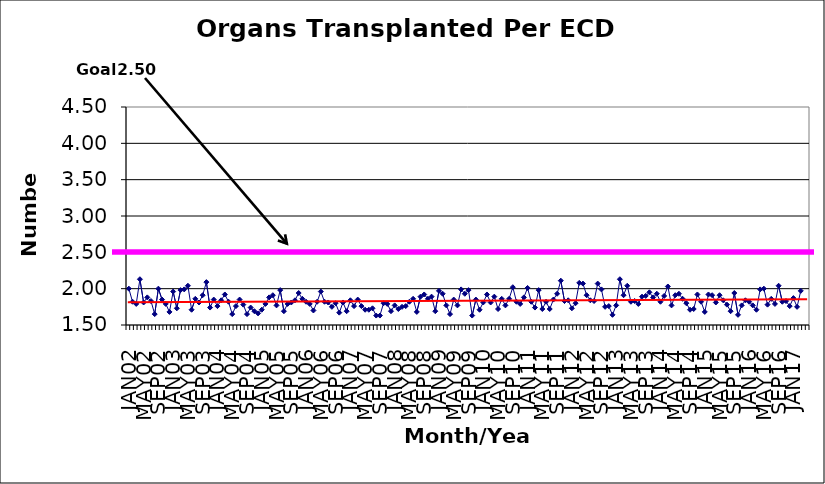
| Category | Series 0 |
|---|---|
| JAN02 | 2 |
| FEB02 | 1.82 |
| MAR02 | 1.79 |
| APR02 | 2.13 |
| MAY02 | 1.81 |
| JUN02 | 1.88 |
| JUL02 | 1.83 |
| AUG02 | 1.65 |
| SEP02 | 2 |
| OCT02 | 1.85 |
| NOV02 | 1.79 |
| DEC02 | 1.68 |
| JAN03 | 1.96 |
| FEB03 | 1.73 |
| MAR03 | 1.98 |
| APR03 | 1.99 |
| MAY03 | 2.04 |
| JUN03 | 1.71 |
| JUL03 | 1.86 |
| AUG03 | 1.81 |
| SEP03 | 1.91 |
| OCT03 | 2.09 |
| NOV03 | 1.74 |
| DEC03 | 1.85 |
| JAN04 | 1.76 |
| FEB04 | 1.84 |
| MAR04 | 1.92 |
| APR04 | 1.82 |
| MAY04 | 1.65 |
| JUN04 | 1.76 |
| JUL04 | 1.85 |
| AUG04 | 1.78 |
| SEP04 | 1.65 |
| OCT04 | 1.74 |
| NOV04 | 1.69 |
| DEC04 | 1.66 |
| JAN05 | 1.71 |
| FEB05 | 1.79 |
| MAR05 | 1.88 |
| APR05 | 1.91 |
| MAY05 | 1.77 |
| JUN05 | 1.98 |
| JUL05 | 1.69 |
| AUG05 | 1.79 |
| SEP05 | 1.81 |
| OCT05 | 1.84 |
| NOV05 | 1.94 |
| DEC05 | 1.86 |
| JAN06 | 1.82 |
| FEB06 | 1.79 |
| MAR06 | 1.7 |
| APR06 | 1.82 |
| MAY06 | 1.96 |
| JUN06 | 1.82 |
| JUL06 | 1.81 |
| AUG06 | 1.75 |
| SEP06 | 1.8 |
| OCT06 | 1.67 |
| NOV06 | 1.81 |
| DEC06 | 1.69 |
| JAN07 | 1.84 |
| FEB07 | 1.76 |
| MAR07 | 1.85 |
| APR07 | 1.76 |
| MAY07 | 1.71 |
| JUN07 | 1.71 |
| JUL07 | 1.73 |
| AUG07 | 1.63 |
| SEP07 | 1.63 |
| OCT07 | 1.8 |
| NOV07 | 1.79 |
| DEC07 | 1.69 |
| JAN08 | 1.77 |
| FEB08 | 1.72 |
| MAR08 | 1.75 |
| APR08 | 1.76 |
| MAY08 | 1.82 |
| JUN08 | 1.86 |
| JUL08 | 1.68 |
| AUG08 | 1.89 |
| SEP08 | 1.92 |
| OCT08 | 1.86 |
| NOV08 | 1.89 |
| DEC08 | 1.69 |
| JAN09 | 1.97 |
| FEB09 | 1.93 |
| MAR09 | 1.77 |
| APR09 | 1.65 |
| MAY09 | 1.85 |
| JUN09 | 1.77 |
| JUL09 | 1.99 |
| AUG09 | 1.93 |
| SEP09 | 1.98 |
| OCT09 | 1.63 |
| NOV09 | 1.85 |
| DEC09 | 1.71 |
| JAN10 | 1.81 |
| FEB10 | 1.92 |
| MAR10 | 1.81 |
| APR10 | 1.89 |
| MAY10 | 1.72 |
| JUN10 | 1.86 |
| JUL10 | 1.77 |
| AUG10 | 1.86 |
| SEP10 | 2.02 |
| OCT10 | 1.82 |
| NOV10 | 1.79 |
| DEC10 | 1.88 |
| JAN11 | 2.01 |
| FEB11 | 1.82 |
| MAR11 | 1.74 |
| APR11 | 1.98 |
| MAY11 | 1.72 |
| JUN11 | 1.82 |
| JUL11 | 1.72 |
| AUG11 | 1.85 |
| SEP11 | 1.93 |
| OCT11 | 2.11 |
| NOV11 | 1.83 |
| DEC11 | 1.84 |
| JAN12 | 1.73 |
| FEB12 | 1.8 |
| MAR12 | 2.08 |
| APR12 | 2.07 |
| MAY12 | 1.91 |
| JUN12 | 1.84 |
| JUL12 | 1.83 |
| AUG12 | 2.07 |
| SEP12 | 1.99 |
| OCT12 | 1.75 |
| NOV12 | 1.76 |
| DEC12 | 1.64 |
| JAN13 | 1.77 |
| FEB13 | 2.13 |
| MAR13 | 1.91 |
| APR13 | 2.04 |
| MAY13 | 1.82 |
| JUN13 | 1.83 |
| JUL13 | 1.79 |
| AUG13 | 1.89 |
| SEP13 | 1.9 |
| OCT13 | 1.95 |
| NOV13 | 1.88 |
| DEC13 | 1.93 |
| JAN14 | 1.82 |
| FEB14 | 1.9 |
| MAR14 | 2.03 |
| APR14 | 1.77 |
| MAY14 | 1.91 |
| JUN14 | 1.93 |
| JUL14 | 1.86 |
| AUG14 | 1.8 |
| SEP14 | 1.71 |
| OCT14 | 1.72 |
| NOV14 | 1.92 |
| DEC14 | 1.82 |
| JAN15 | 1.68 |
| FEB15 | 1.92 |
| MAR15 | 1.91 |
| APR15 | 1.81 |
| MAY15 | 1.91 |
| JUN15 | 1.84 |
| JUL15 | 1.78 |
| AUG15 | 1.69 |
| SEP15 | 1.94 |
| OCT15 | 1.64 |
| NOV15 | 1.77 |
| DEC15 | 1.84 |
| JAN16 | 1.82 |
| FEB16 | 1.77 |
| MAR16 | 1.71 |
| APR16 | 1.99 |
| MAY16 | 2 |
| JUN16 | 1.78 |
| JUL16 | 1.86 |
| AUG16 | 1.79 |
| SEP16 | 2.04 |
| OCT16 | 1.82 |
| NOV16 | 1.83 |
| DEC16 | 1.76 |
| JAN17 | 1.87 |
| FEB17 | 1.75 |
| MAR17 | 1.97 |